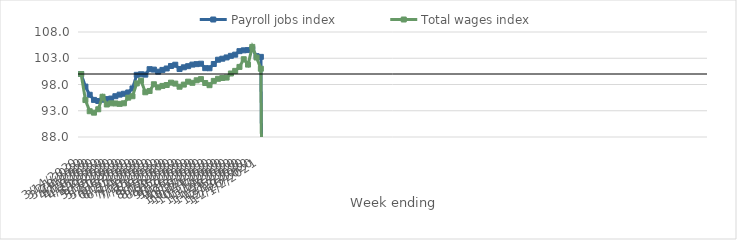
| Category | Payroll jobs index | Total wages index |
|---|---|---|
| 14/03/2020 | 100 | 100 |
| 21/03/2020 | 97.603 | 95.037 |
| 28/03/2020 | 96.043 | 92.91 |
| 04/04/2020 | 95.068 | 92.637 |
| 11/04/2020 | 94.858 | 93.282 |
| 18/04/2020 | 95.101 | 95.662 |
| 25/04/2020 | 95.222 | 94.192 |
| 02/05/2020 | 95.325 | 94.415 |
| 09/05/2020 | 95.769 | 94.391 |
| 16/05/2020 | 96.069 | 94.308 |
| 23/05/2020 | 96.236 | 94.422 |
| 30/05/2020 | 96.483 | 95.494 |
| 06/06/2020 | 97.248 | 95.767 |
| 13/06/2020 | 99.843 | 98.212 |
| 20/06/2020 | 99.949 | 98.731 |
| 27/06/2020 | 99.879 | 96.52 |
| 04/07/2020 | 100.922 | 96.765 |
| 11/07/2020 | 100.839 | 98.047 |
| 18/07/2020 | 100.442 | 97.455 |
| 25/07/2020 | 100.779 | 97.731 |
| 01/08/2020 | 101.052 | 97.903 |
| 08/08/2020 | 101.527 | 98.353 |
| 15/08/2020 | 101.767 | 98.171 |
| 22/08/2020 | 100.948 | 97.576 |
| 29/08/2020 | 101.275 | 97.98 |
| 05/09/2020 | 101.492 | 98.54 |
| 12/09/2020 | 101.79 | 98.322 |
| 19/09/2020 | 101.879 | 98.803 |
| 26/09/2020 | 101.961 | 99.026 |
| 03/10/2020 | 101.112 | 98.288 |
| 10/10/2020 | 101.094 | 97.871 |
| 17/10/2020 | 101.904 | 98.686 |
| 24/10/2020 | 102.719 | 99.087 |
| 31/10/2020 | 102.911 | 99.238 |
| 07/11/2020 | 103.155 | 99.317 |
| 14/11/2020 | 103.46 | 100.096 |
| 21/11/2020 | 103.687 | 100.593 |
| 28/11/2020 | 104.353 | 101.349 |
| 05/12/2020 | 104.508 | 102.814 |
| 12/12/2020 | 104.555 | 101.79 |
| 19/12/2020 | 104.775 | 105.161 |
| 26/12/2020 | 103.402 | 103.138 |
| 02/01/2021 | 103.264 | 101.003 |